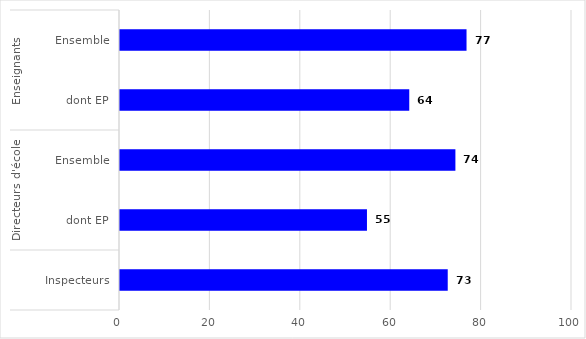
| Category | Series 0 |
|---|---|
| 0 | 76.667 |
| 1 | 63.995 |
| 2 | 74.203 |
| 3 | 54.638 |
| 4 | 72.507 |